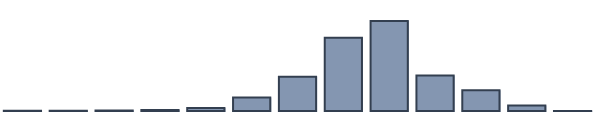
| Category | Series 0 |
|---|---|
| 0 | 0.087 |
| 1 | 0.087 |
| 2 | 0.174 |
| 3 | 0.348 |
| 4 | 1.087 |
| 5 | 4.826 |
| 6 | 12.348 |
| 7 | 26.391 |
| 8 | 32.391 |
| 9 | 12.783 |
| 10 | 7.435 |
| 11 | 2 |
| 12 | 0.043 |